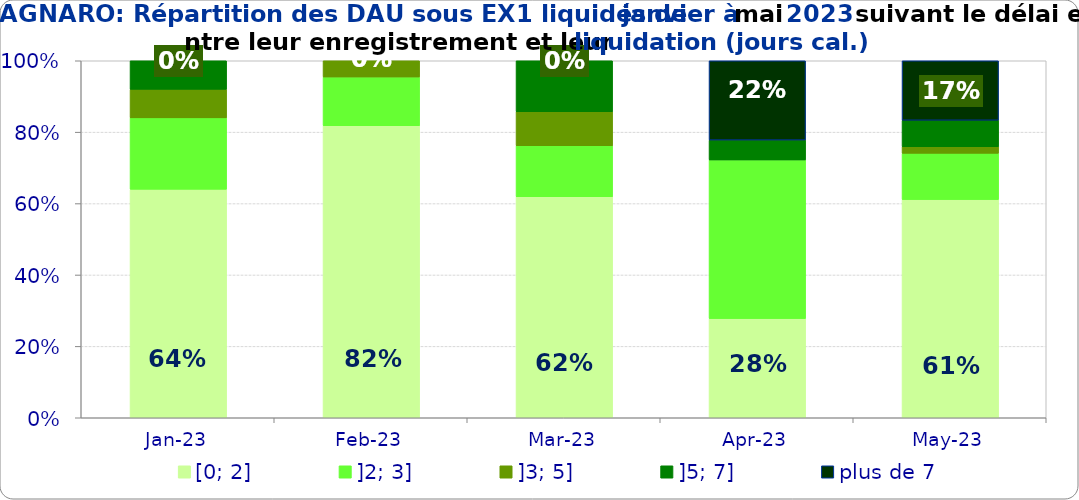
| Category | [0; 2] | ]2; 3] | ]3; 5] | ]5; 7] | plus de 7 |
|---|---|---|---|---|---|
| 2023-01-01 | 0.64 | 0.2 | 0.08 | 0.08 | 0 |
| 2023-02-01 | 0.818 | 0.136 | 0.045 | 0 | 0 |
| 2023-03-01 | 0.619 | 0.143 | 0.095 | 0.143 | 0 |
| 2023-04-01 | 0.278 | 0.444 | 0 | 0.056 | 0.222 |
| 2023-05-01 | 0.611 | 0.13 | 0.019 | 0.074 | 0.167 |